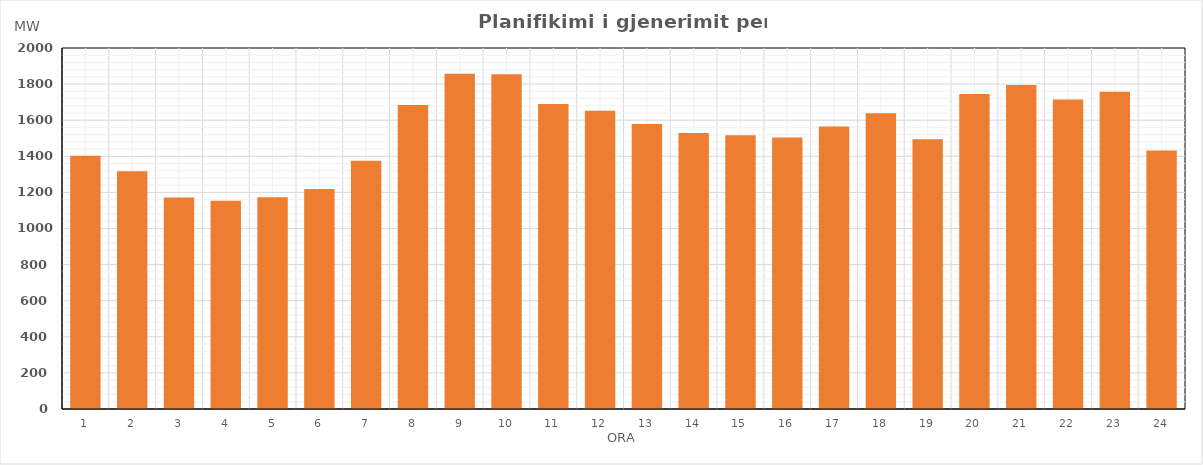
| Category | Max (MW) |
|---|---|
| 0 | 1403.21 |
| 1 | 1317.75 |
| 2 | 1171.41 |
| 3 | 1153.09 |
| 4 | 1173.42 |
| 5 | 1219.08 |
| 6 | 1375.36 |
| 7 | 1683.9 |
| 8 | 1857.38 |
| 9 | 1854.28 |
| 10 | 1689.24 |
| 11 | 1652.21 |
| 12 | 1579.13 |
| 13 | 1529.12 |
| 14 | 1516.36 |
| 15 | 1504.42 |
| 16 | 1565.5 |
| 17 | 1639.02 |
| 18 | 1494.41 |
| 19 | 1745.37 |
| 20 | 1795.41 |
| 21 | 1714.64 |
| 22 | 1757.19 |
| 23 | 1432.57 |